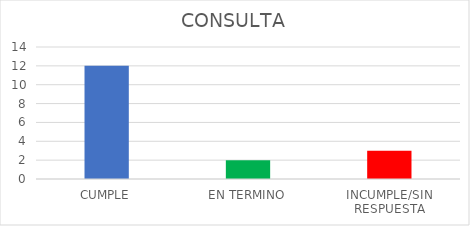
| Category | Series 0 |
|---|---|
| CUMPLE | 12 |
| EN TERMINO | 2 |
| INCUMPLE/SIN RESPUESTA | 3 |